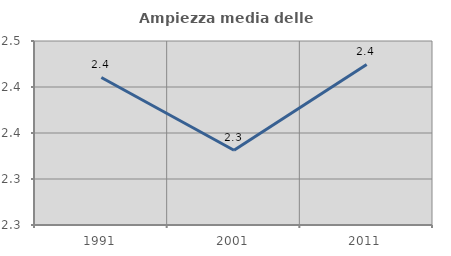
| Category | Ampiezza media delle famiglie |
|---|---|
| 1991.0 | 2.41 |
| 2001.0 | 2.331 |
| 2011.0 | 2.424 |